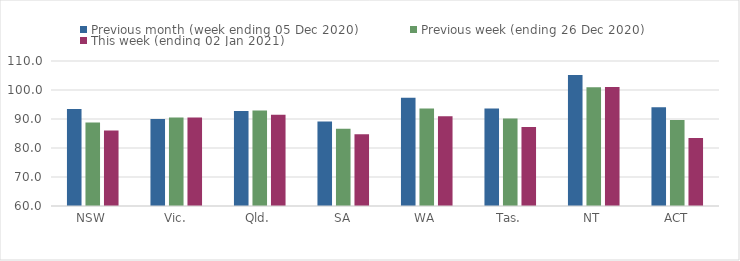
| Category | Previous month (week ending 05 Dec 2020) | Previous week (ending 26 Dec 2020) | This week (ending 02 Jan 2021) |
|---|---|---|---|
| NSW | 93.44 | 88.78 | 86 |
| Vic. | 89.96 | 90.55 | 90.49 |
| Qld. | 92.8 | 92.91 | 91.47 |
| SA | 89.16 | 86.61 | 84.76 |
| WA | 97.36 | 93.64 | 90.97 |
| Tas. | 93.65 | 90.14 | 87.25 |
| NT | 105.17 | 100.93 | 101.05 |
| ACT | 94.08 | 89.66 | 83.48 |